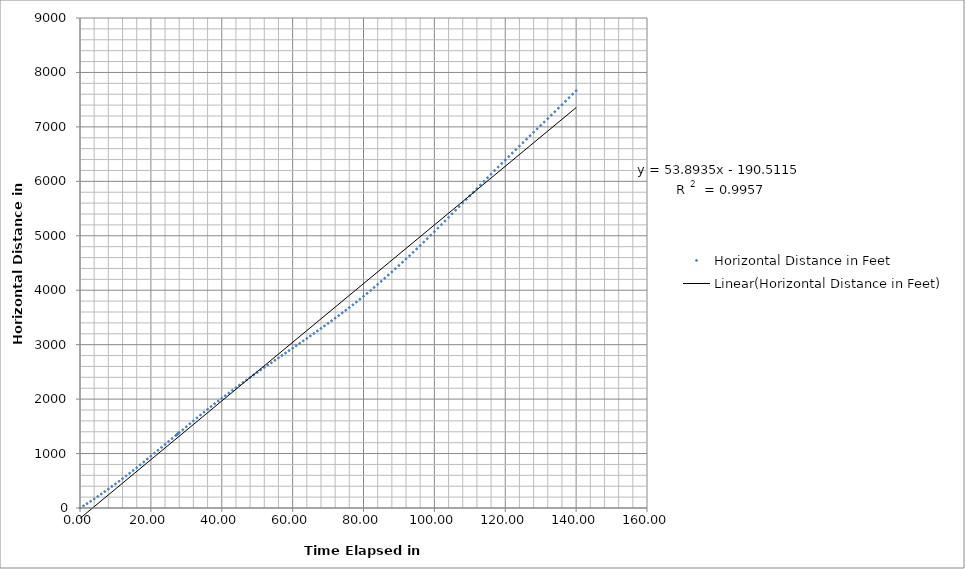
| Category | Horizontal Distance in Feet |
|---|---|
| 0.0 | 0 |
| 1.0 | 40.354 |
| 2.0 | 80.785 |
| 3.0 | 122.207 |
| 4.0 | 166.25 |
| 5.0 | 211.165 |
| 6.0 | 256.477 |
| 7.0 | 301.595 |
| 8.0 | 348.189 |
| 9.0 | 395.181 |
| 10.0 | 442.666 |
| 11.0 | 491.084 |
| 12.0 | 539.905 |
| 13.0 | 589.31 |
| 14.0 | 639.118 |
| 15.0 | 689.801 |
| 15.998999999996158 | 740.99 |
| 17.0 | 792.996 |
| 18.0 | 845.347 |
| 19.0 | 898.282 |
| 20.0 | 952.03 |
| 21.0 | 1005.705 |
| 22.0 | 1059.511 |
| 23.0 | 1113.449 |
| 24.0 | 1167.793 |
| 25.0 | 1221.575 |
| 26.0 | 1275.906 |
| 27.0 | 1330.101 |
| 27.19999999999709 | 1341.109 |
| 27.39999999999418 | 1351.835 |
| 27.60000000000582 | 1362.562 |
| 27.80000000000291 | 1373.57 |
| 28.0 | 1384.296 |
| 29.0 | 1438.491 |
| 30.0 | 1492.558 |
| 31.0 | 1546.621 |
| 32.0 | 1600.684 |
| 33.0 | 1654.598 |
| 34.0 | 1708.116 |
| 35.0 | 1760.88 |
| 36.0 | 1812.657 |
| 37.0 | 1863.684 |
| 38.0 | 1913.544 |
| 39.0 | 1963.349 |
| 40.0 | 2013.135 |
| 41.0 | 2062.198 |
| 42.0 | 2111.514 |
| 43.0 | 2160.282 |
| 44.0 | 2208.796 |
| 45.0 | 2257.199 |
| 46.0 | 2304.89 |
| 47.0 | 2351.927 |
| 48.0 | 2398.352 |
| 49.0 | 2444.212 |
| 50.0 | 2489.874 |
| 51.0 | 2535.044 |
| 52.0 | 2579.805 |
| 53.0 | 2624.416 |
| 54.0 | 2668.718 |
| 55.0 | 2713 |
| 56.0 | 2757.206 |
| 57.0 | 2801.155 |
| 58.0 | 2845.69 |
| 59.0 | 2890.351 |
| 60.0 | 2934.78 |
| 61.0 | 2979.443 |
| 62.0 | 3024.174 |
| 63.0 | 3069.032 |
| 64.0 | 3114.455 |
| 65.0 | 3159.928 |
| 66.0 | 3205.608 |
| 67.0 | 3251.938 |
| 68.0 | 3298.421 |
| 69.0 | 3345.098 |
| 70.0 | 3391.825 |
| 71.0 | 3439.024 |
| 72.0 | 3486.805 |
| 73.0 | 3534.479 |
| 74.0 | 3583.195 |
| 75.0 | 3631.664 |
| 76.0 | 3681.449 |
| 77.0 | 3731.678 |
| 78.0 | 3782.831 |
| 79.0 | 3834.708 |
| 80.0 | 3887.79 |
| 81.0 | 3941.208 |
| 82.0 | 3995.658 |
| 83.0 | 4050.988 |
| 84.0 | 4107.06 |
| 85.0 | 4163.566 |
| 86.0 | 4220.356 |
| 87.0 | 4277.891 |
| 88.0 | 4335.77 |
| 89.0 | 4394.167 |
| 90.0 | 4452.954 |
| 91.0 | 4512.859 |
| 92.0 | 4573.208 |
| 93.0 | 4634.442 |
| 94.0 | 4695.929 |
| 95.0 | 4757.993 |
| 96.0 | 4820.634 |
| 97.0 | 4883.457 |
| 98.0 | 4946.791 |
| 99.0 | 5010.704 |
| 100.0 | 5074.908 |
| 101.0 | 5139.807 |
| 102.0 | 5205.226 |
| 103.0 | 5271.337 |
| 104.0 | 5337.045 |
| 105.0 | 5403.044 |
| 106.0 | 5469.046 |
| 107.0 | 5535.158 |
| 108.0 | 5601.269 |
| 109.0 | 5667.383 |
| 110.0 | 5733.786 |
| 111.0 | 5800.076 |
| 112.0 | 5866.367 |
| 113.0 | 5933.056 |
| 114.0 | 5999.458 |
| 115.0 | 6065.859 |
| 116.0 | 6132.149 |
| 117.0 | 6197.742 |
| 118.0 | 6262.526 |
| 119.0 | 6327.135 |
| 120.0 | 6391.048 |
| 121.0 | 6454.961 |
| 122.0 | 6518.763 |
| 123.0 | 6582.386 |
| 124.0 | 6646.417 |
| 125.0 | 6710.158 |
| 126.0 | 6773.899 |
| 127.0 | 6837.232 |
| 128.0 | 6900.573 |
| 129.0 | 6963.039 |
| 130.0 | 7026.148 |
| 131.0 | 7088.968 |
| 132.0 | 7152.591 |
| 133.0 | 7215.814 |
| 134.0 | 7279.555 |
| 135.0 | 7343.296 |
| 136.0 | 7407.444 |
| 137.0 | 7471.475 |
| 138.0 | 7535.796 |
| 139.0 | 7599.598 |
| 140.0 | 7663.512 |